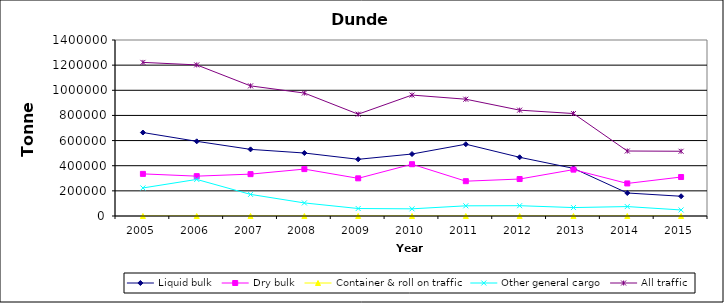
| Category | Liquid bulk | Dry bulk | Container & roll on traffic | Other general cargo | All traffic |
|---|---|---|---|---|---|
| 2005.0 | 664000 | 335000 | 0 | 223000 | 1222000 |
| 2006.0 | 594000 | 317000 | 0 | 291000 | 1202000 |
| 2007.0 | 530000 | 333000 | 0 | 172000 | 1035000 |
| 2008.0 | 501000 | 373000 | 0 | 104000 | 978000 |
| 2009.0 | 450942 | 299559 | 0 | 59441 | 809942 |
| 2010.0 | 493000 | 412000 | 0 | 57000 | 962000 |
| 2011.0 | 571000 | 277000 | 0 | 81000 | 929000 |
| 2012.0 | 467000 | 294000 | 0 | 82000 | 842000 |
| 2013.0 | 379000 | 369000 | 0 | 67000 | 815000 |
| 2014.0 | 183000 | 259000 | 0 | 75000 | 517000 |
| 2015.0 | 157000 | 310000 | 0 | 48000 | 515000 |